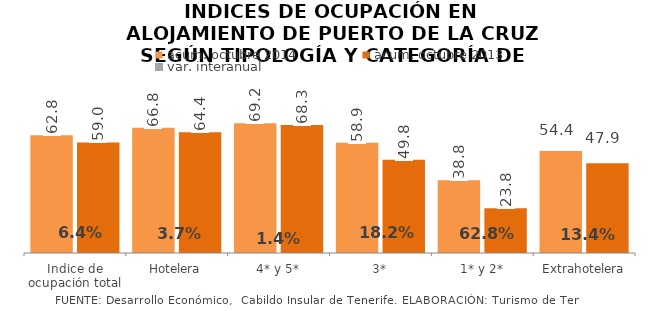
| Category | acum. octubre 2014 | acum. octubre 2013 |
|---|---|---|
| Indice de ocupación total | 62.75 | 58.984 |
| Hotelera | 66.835 | 64.444 |
| 4* y 5* | 69.23 | 68.283 |
| 3* | 58.865 | 49.792 |
| 1* y 2* | 38.815 | 23.839 |
| Extrahotelera | 54.361 | 47.922 |